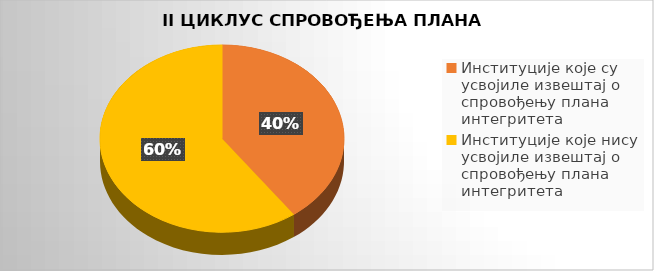
| Category | Series 0 |
|---|---|
| Институције које су усвојиле извештај о спровођењу плана интегритета | 0.4 |
| Институције које нису усвојиле извештај о спровођењу плана интегритета | 0.6 |